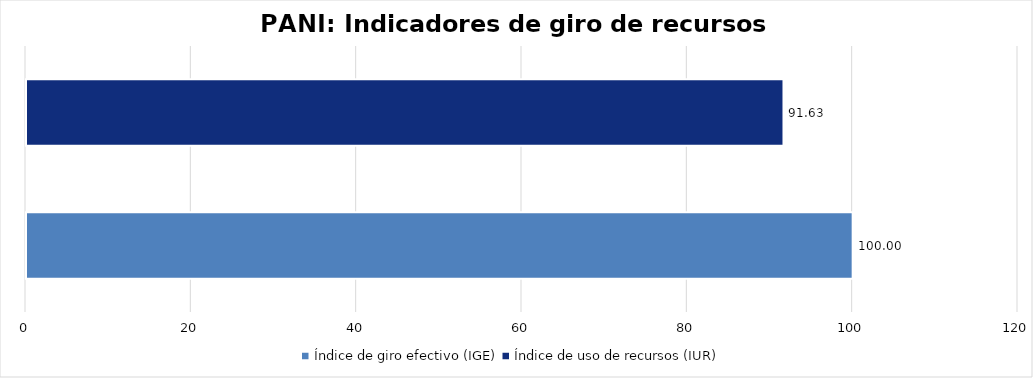
| Category | Total programa |
|---|---|
| Índice de giro efectivo (IGE) | 100 |
| Índice de uso de recursos (IUR)  | 91.631 |